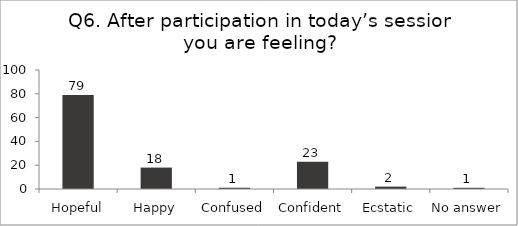
| Category | Q6. After participation in today’s session you are feeling? |
|---|---|
| Hopeful | 79 |
| Happy | 18 |
| Confused | 1 |
| Confident | 23 |
| Ecstatic | 2 |
| No answer | 1 |